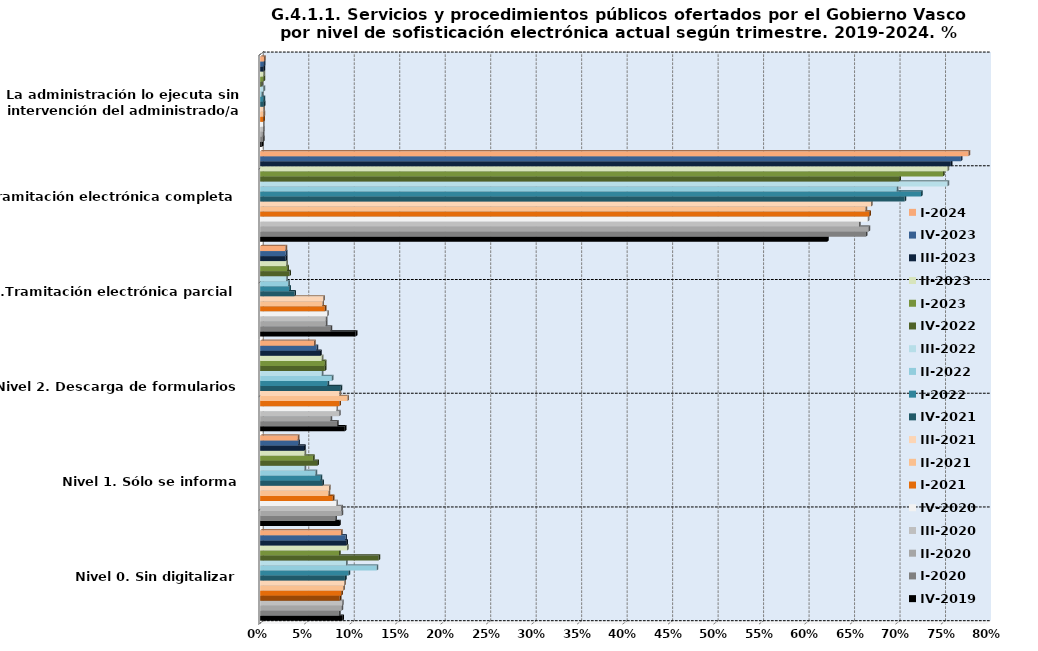
| Category | IV-2019 | I-2020 | II-2020 | III-2020 | IV-2020 | I-2021 | II-2021 | III-2021 | IV-2021 | I-2022 | II-2022 | III-2022 | IV-2022 | I-2023 | II-2023 | III-2023 | IV-2023 | I-2024 |
|---|---|---|---|---|---|---|---|---|---|---|---|---|---|---|---|---|---|---|
| Nivel 0. Sin digitalizar | 0.09 | 0.087 | 0.089 | 0.09 | 0.087 | 0.089 | 0.091 | 0.093 | 0.093 | 0.097 | 0.128 | 0.094 | 0.13 | 0.087 | 0.096 | 0.095 | 0.094 | 0.089 |
| Nivel 1. Sólo se informa | 0.087 | 0.083 | 0.089 | 0.089 | 0.084 | 0.08 | 0.075 | 0.076 | 0.068 | 0.066 | 0.061 | 0.049 | 0.063 | 0.058 | 0.049 | 0.048 | 0.042 | 0.041 |
| Nivel 2. Descarga de formularios | 0.093 | 0.085 | 0.077 | 0.087 | 0.084 | 0.087 | 0.096 | 0.087 | 0.088 | 0.074 | 0.079 | 0.068 | 0.071 | 0.071 | 0.068 | 0.066 | 0.062 | 0.059 |
| Nivel 3.Tramitación electrónica parcial | 0.105 | 0.077 | 0.072 | 0.072 | 0.074 | 0.071 | 0.068 | 0.069 | 0.038 | 0.032 | 0.031 | 0.029 | 0.032 | 0.03 | 0.029 | 0.028 | 0.028 | 0.028 |
| Nivel 4 Tramitación electrónica completa | 0.623 | 0.666 | 0.669 | 0.658 | 0.668 | 0.67 | 0.665 | 0.672 | 0.709 | 0.727 | 0.7 | 0.756 | 0.703 | 0.751 | 0.756 | 0.759 | 0.77 | 0.779 |
| Nivel 5. La administración lo ejecuta sin intervención del administrado/a | 0.002 | 0.003 | 0.003 | 0.003 | 0.003 | 0.003 | 0.004 | 0.004 | 0.004 | 0.004 | 0.002 | 0.004 | 0.001 | 0.004 | 0.004 | 0.004 | 0.004 | 0.004 |